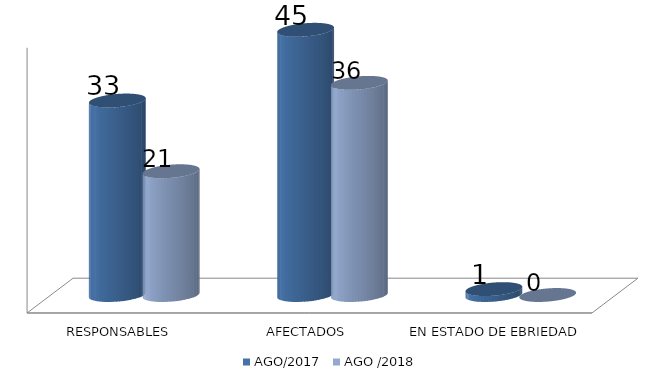
| Category | AGO/2017 | AGO /2018 |
|---|---|---|
| RESPONSABLES | 33 | 21 |
| AFECTADOS | 45 | 36 |
| EN ESTADO DE EBRIEDAD | 1 | 0 |